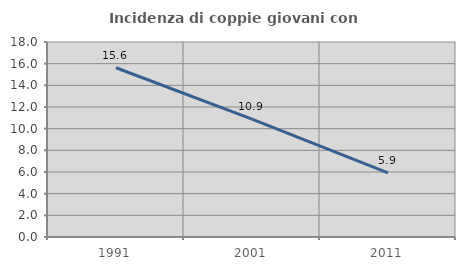
| Category | Incidenza di coppie giovani con figli |
|---|---|
| 1991.0 | 15.625 |
| 2001.0 | 10.879 |
| 2011.0 | 5.918 |